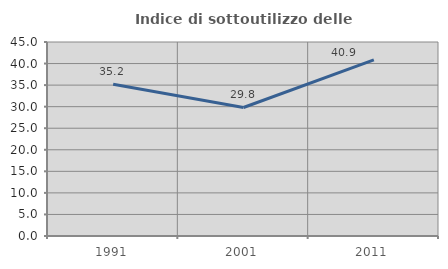
| Category | Indice di sottoutilizzo delle abitazioni  |
|---|---|
| 1991.0 | 35.185 |
| 2001.0 | 29.814 |
| 2011.0 | 40.854 |